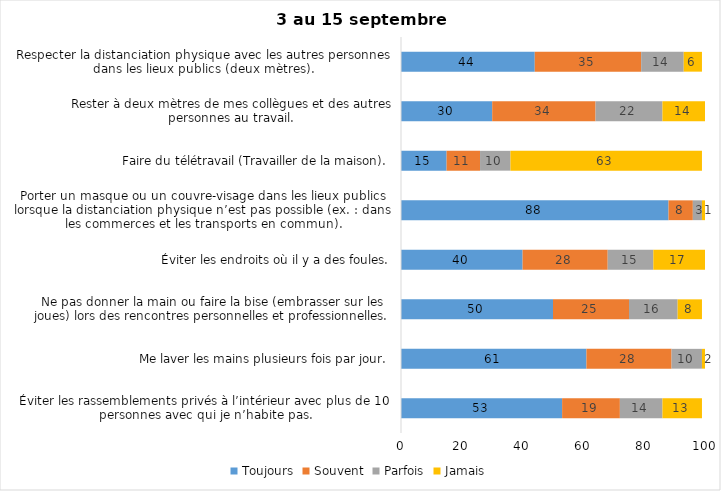
| Category | Toujours | Souvent | Parfois | Jamais |
|---|---|---|---|---|
| Éviter les rassemblements privés à l’intérieur avec plus de 10 personnes avec qui je n’habite pas. | 53 | 19 | 14 | 13 |
| Me laver les mains plusieurs fois par jour. | 61 | 28 | 10 | 2 |
| Ne pas donner la main ou faire la bise (embrasser sur les joues) lors des rencontres personnelles et professionnelles. | 50 | 25 | 16 | 8 |
| Éviter les endroits où il y a des foules. | 40 | 28 | 15 | 17 |
| Porter un masque ou un couvre-visage dans les lieux publics lorsque la distanciation physique n’est pas possible (ex. : dans les commerces et les transports en commun). | 88 | 8 | 3 | 1 |
| Faire du télétravail (Travailler de la maison). | 15 | 11 | 10 | 63 |
| Rester à deux mètres de mes collègues et des autres personnes au travail. | 30 | 34 | 22 | 14 |
| Respecter la distanciation physique avec les autres personnes dans les lieux publics (deux mètres). | 44 | 35 | 14 | 6 |